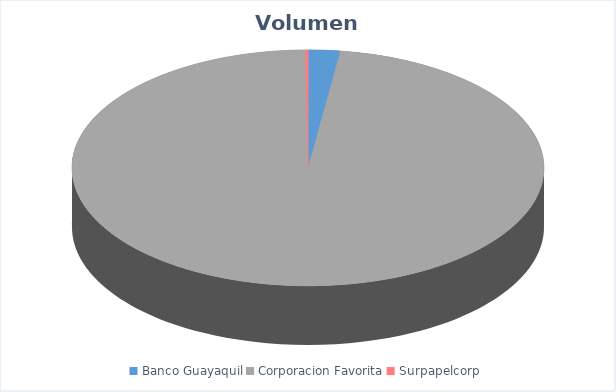
| Category | VOLUMEN ($USD) |
|---|---|
| Banco Guayaquil | 2891.32 |
| Corporacion Favorita | 129193.69 |
| Surpapelcorp | 255 |